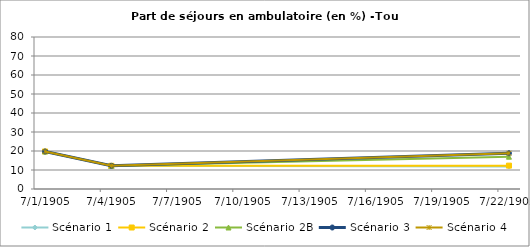
| Category | Scénario 1 | Scénario 2 | Scénario 2B | Scénario 3 | Scénario 4 |
|---|---|---|---|---|---|
| 2009.0 | 19.748 | 19.748 | 19.748 | 19.748 | 19.748 |
| 2012.0 | 12.21 | 12.21 | 12.21 | 12.21 | 12.21 |
| 2030.0 | 11.887 | 12.301 | 17.005 | 18.823 | 18.823 |